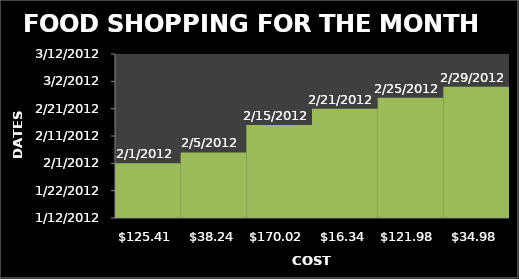
| Category | Series 0 |
|---|---|
| 125.41 | 2/1/12 |
| 38.24 | 2/5/12 |
| 170.02 | 2/15/12 |
| 16.34 | 2/21/12 |
| 121.98 | 2/25/12 |
| 34.98 | 2/29/12 |